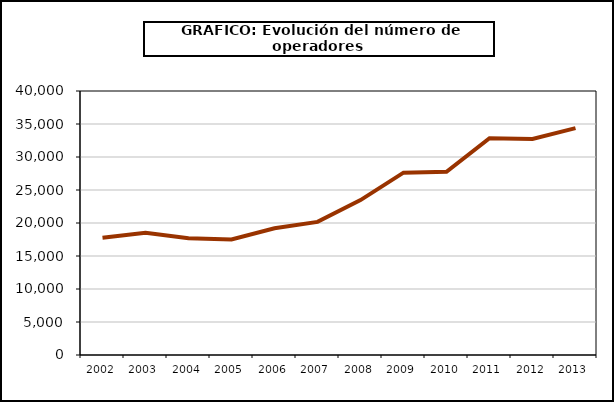
| Category | Operadores (*) |
|---|---|
| 2002.0 | 17751 |
| 2003.0 | 18505 |
| 2004.0 | 17688 |
| 2005.0 | 17509 |
| 2006.0 | 19211 |
| 2007.0 | 20171 |
| 2008.0 | 23473 |
| 2009.0 | 27627 |
| 2010.0 | 27767 |
| 2011.0 | 32837 |
| 2012.0 | 32724 |
| 2013.0 | 34370 |